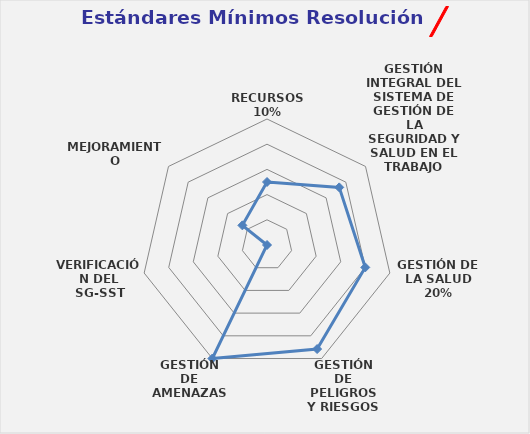
| Category | Series 0 |
|---|---|
| RECURSOS
10% | 0.5 |
| GESTIÓN INTEGRAL DEL SISTEMA DE GESTIÓN DE LA SEGURIDAD Y SALUD EN EL TRABAJO
15% | 0.733 |
| GESTIÓN DE LA SALUD
20% | 0.8 |
| GESTIÓN DE PELIGROS Y RIESGOS
30% | 0.917 |
| GESTIÓN DE AMENAZAS
10% | 1 |
| VERIFICACIÓN DEL SG-SST
5% | 0 |
| MEJORAMIENTO
10% | 0.25 |